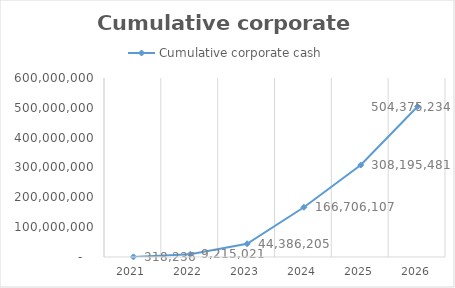
| Category | Cumulative corporate cash |
|---|---|
| 2021.0 | 318236.11 |
| 2022.0 | 9215020.752 |
| 2023.0 | 44386204.83 |
| 2024.0 | 166706107.247 |
| 2025.0 | 308195480.52 |
| 2026.0 | 504375234.03 |